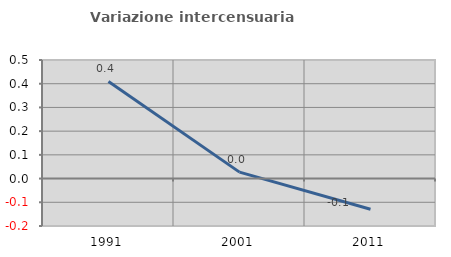
| Category | Variazione intercensuaria annua |
|---|---|
| 1991.0 | 0.41 |
| 2001.0 | 0.027 |
| 2011.0 | -0.129 |